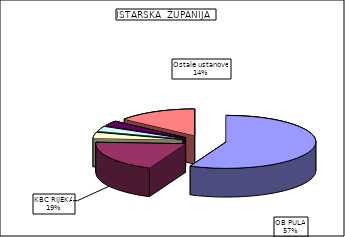
| Category | Series 0 |
|---|---|
| OB PULA | 56.591 |
| KBC RIJEKA | 19.309 |
| KLINIKA ZA ORTOPEDIJU LOVRAN | 3.683 |
| KBC ZAGREB  | 3.026 |
| DZ ISTARSKI | 3.004 |
| Ostale ustanove | 14.387 |